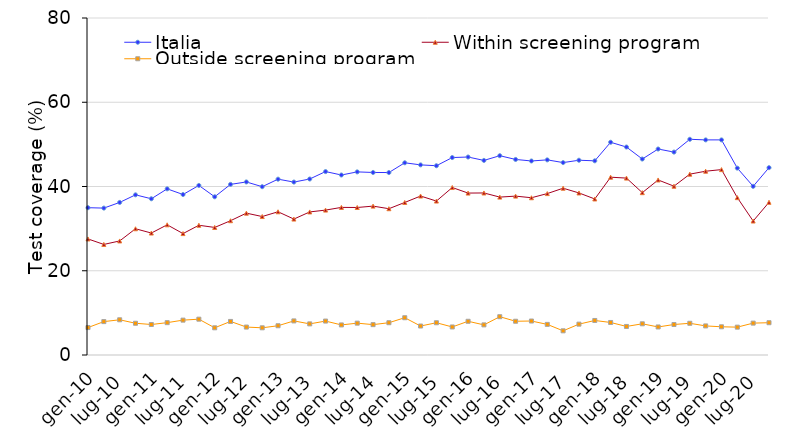
| Category | Italia | Within screening program | Outside screening program |
|---|---|---|---|
| gen-10 | 34.968 | 27.55 | 6.517 |
| apr-10 | 34.871 | 26.247 | 7.93 |
| lug-10 | 36.219 | 27.074 | 8.359 |
| ott-10 | 38.022 | 29.968 | 7.534 |
| gen-11 | 37.088 | 28.95 | 7.237 |
| apr-11 | 39.441 | 30.907 | 7.68 |
| lug-11 | 38.099 | 28.824 | 8.279 |
| ott-11 | 40.252 | 30.798 | 8.504 |
| gen-12 | 37.558 | 30.28 | 6.457 |
| apr-12 | 40.501 | 31.877 | 7.97 |
| lug-12 | 41.079 | 33.674 | 6.629 |
| ott-12 | 39.952 | 32.868 | 6.454 |
| gen-13 | 41.738 | 34 | 6.947 |
| apr-13 | 41.051 | 32.267 | 8.09 |
| lug-13 | 41.779 | 33.964 | 7.389 |
| ott-13 | 43.542 | 34.398 | 8.054 |
| gen-14 | 42.728 | 35.04 | 7.137 |
| apr-14 | 43.471 | 35.017 | 7.56 |
| lug-14 | 43.329 | 35.344 | 7.209 |
| ott-14 | 43.312 | 34.728 | 7.664 |
| gen-15 | 45.628 | 36.21 | 8.847 |
| apr-15 | 45.131 | 37.737 | 6.88 |
| lug-15 | 44.929 | 36.544 | 7.659 |
| ott-15 | 46.872 | 39.758 | 6.654 |
| gen-16 | 46.998 | 38.44 | 8.007 |
| apr-16 | 46.191 | 38.467 | 7.15 |
| lug-16 | 47.309 | 37.484 | 9.089 |
| ott-16 | 46.422 | 37.718 | 8.014 |
| gen-17 | 46.058 | 37.33 | 8.067 |
| apr-17 | 46.321 | 38.317 | 7.27 |
| lug-17 | 45.679 | 39.594 | 5.739 |
| ott-17 | 46.232 | 38.468 | 7.324 |
| gen-18 | 46.098 | 37.04 | 8.197 |
| apr-18 | 50.501 | 42.207 | 7.72 |
| lug-18 | 49.369 | 41.994 | 6.779 |
| ott-18 | 46.522 | 38.538 | 7.404 |
| gen-19 | 48.898 | 41.55 | 6.657 |
| apr-19 | 48.171 | 40.077 | 7.24 |
| lug-19 | 51.209 | 42.934 | 7.529 |
| ott-19 | 51.062 | 43.628 | 6.904 |
| gen-20 | 51.068 | 44.01 | 6.697 |
| apr-20 | 44.361 | 37.357 | 6.61 |
| lug-20 | 40.039 | 31.804 | 7.569 |
| ott-20 | 44.472 | 36.248 | 7.664 |